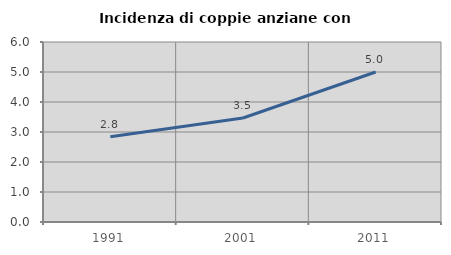
| Category | Incidenza di coppie anziane con figli |
|---|---|
| 1991.0 | 2.839 |
| 2001.0 | 3.466 |
| 2011.0 | 4.999 |